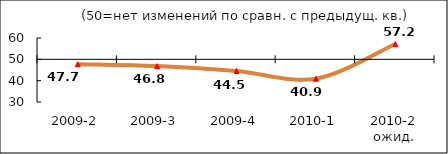
| Category | Диф.индекс ↓ |
|---|---|
| 2009-2 | 47.725 |
| 2009-3 | 46.82 |
| 2009-4 | 44.53 |
| 2010-1 | 40.91 |
| 2010-2 ожид. | 57.17 |